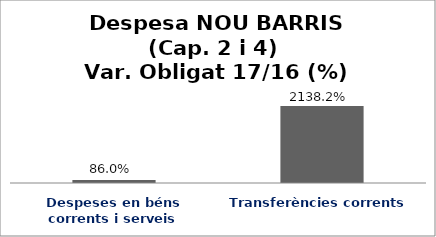
| Category | Series 0 |
|---|---|
| Despeses en béns corrents i serveis | 0.86 |
| Transferències corrents | 21.382 |